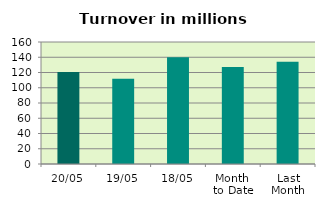
| Category | Series 0 |
|---|---|
| 20/05 | 120.566 |
| 19/05 | 111.684 |
| 18/05 | 140.075 |
| Month 
to Date | 127.09 |
| Last
Month | 133.981 |